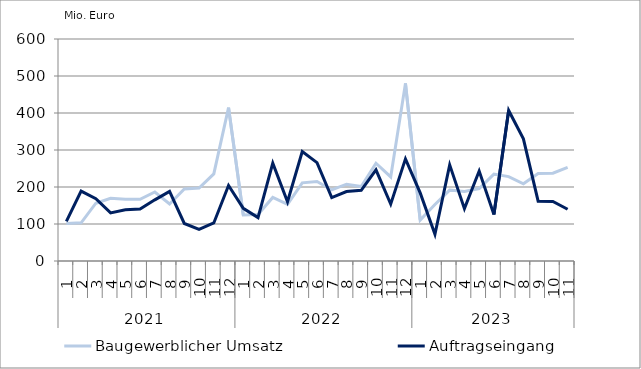
| Category | Baugewerblicher Umsatz | Auftragseingang |
|---|---|---|
| 0 | 101295.895 | 106850.127 |
| 1 | 103236.543 | 188883.434 |
| 2 | 156172.725 | 168204.42 |
| 3 | 169257.088 | 130052.073 |
| 4 | 166897.821 | 138492.214 |
| 5 | 166720.216 | 140262.426 |
| 6 | 186515.191 | 165331.191 |
| 7 | 154188.941 | 188169.655 |
| 8 | 194464.12 | 101359.538 |
| 9 | 197281.201 | 85626.862 |
| 10 | 235325.083 | 102880.924 |
| 11 | 414469.471 | 203900.676 |
| 12 | 124217.549 | 142351.759 |
| 13 | 125619.696 | 117194.423 |
| 14 | 171896.664 | 264509.013 |
| 15 | 153384.654 | 160146.519 |
| 16 | 211335.38 | 295997.826 |
| 17 | 214914.164 | 265813.917 |
| 18 | 192047.613 | 171529.517 |
| 19 | 207577.681 | 187809.656 |
| 20 | 201109.781 | 190941.096 |
| 21 | 264135.048 | 246250.021 |
| 22 | 227299.047 | 153783.993 |
| 23 | 480026.589 | 276019.328 |
| 24 | 110408.991 | 184068.731 |
| 25 | 152702.87 | 72330.186 |
| 26 | 191677.032 | 259741.102 |
| 27 | 187876.702 | 141464.389 |
| 28 | 195815.34 | 243069.898 |
| 29 | 234759.067 | 125882.939 |
| 30 | 228043.08 | 406932.293 |
| 31 | 208510.786 | 330128.024 |
| 32 | 236511.503 | 161760.047 |
| 33 | 237275.194 | 161029.305 |
| 34 | 252921.567 | 139832.011 |